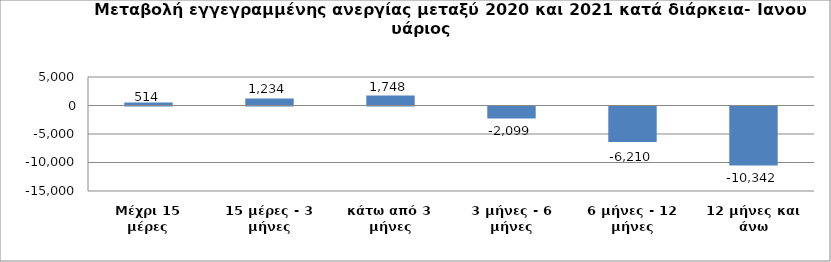
| Category | Series 0 |
|---|---|
| Μέχρι 15 μέρες | 514 |
| 15 μέρες - 3 μήνες | 1234 |
| κάτω από 3 μήνες | 1748 |
| 3 μήνες - 6 μήνες | -2099 |
| 6 μήνες - 12 μήνες | -6210 |
| 12 μήνες και άνω | -10342 |